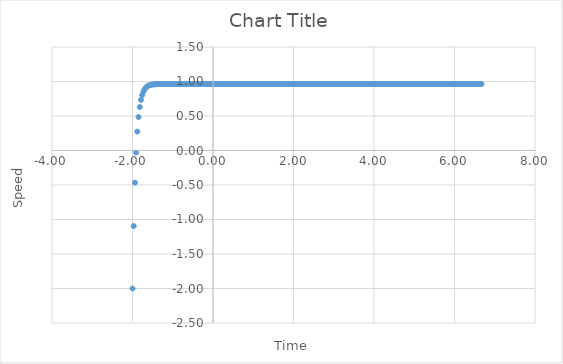
| Category | Series 0 |
|---|---|
| -2.0 | -2 |
| -1.97 | -1.095 |
| -1.94 | -0.466 |
| -1.91 | -0.029 |
| -1.88 | 0.274 |
| -1.8499999999999999 | 0.485 |
| -1.8199999999999998 | 0.631 |
| -1.7899999999999998 | 0.732 |
| -1.7599999999999998 | 0.803 |
| -1.7299999999999998 | 0.852 |
| -1.6999999999999997 | 0.886 |
| -1.6699999999999997 | 0.91 |
| -1.6399999999999997 | 0.926 |
| -1.6099999999999997 | 0.937 |
| -1.5799999999999996 | 0.945 |
| -1.5499999999999996 | 0.951 |
| -1.5199999999999996 | 0.955 |
| -1.4899999999999995 | 0.957 |
| -1.4599999999999995 | 0.959 |
| -1.4299999999999995 | 0.961 |
| -1.3999999999999995 | 0.961 |
| -1.3699999999999994 | 0.962 |
| -1.3399999999999994 | 0.962 |
| -1.3099999999999994 | 0.963 |
| -1.2799999999999994 | 0.963 |
| -1.2499999999999993 | 0.963 |
| -1.2199999999999993 | 0.963 |
| -1.1899999999999993 | 0.963 |
| -1.1599999999999993 | 0.963 |
| -1.1299999999999992 | 0.963 |
| -1.0999999999999992 | 0.963 |
| -1.0699999999999992 | 0.963 |
| -1.0399999999999991 | 0.963 |
| -1.0099999999999991 | 0.963 |
| -0.9799999999999991 | 0.963 |
| -0.9499999999999991 | 0.963 |
| -0.919999999999999 | 0.963 |
| -0.889999999999999 | 0.963 |
| -0.859999999999999 | 0.963 |
| -0.829999999999999 | 0.963 |
| -0.7999999999999989 | 0.963 |
| -0.7699999999999989 | 0.963 |
| -0.7399999999999989 | 0.963 |
| -0.7099999999999989 | 0.963 |
| -0.6799999999999988 | 0.963 |
| -0.6499999999999988 | 0.963 |
| -0.6199999999999988 | 0.963 |
| -0.5899999999999987 | 0.963 |
| -0.5599999999999987 | 0.963 |
| -0.5299999999999987 | 0.963 |
| -0.49999999999999867 | 0.963 |
| -0.46999999999999864 | 0.963 |
| -0.4399999999999986 | 0.963 |
| -0.4099999999999986 | 0.963 |
| -0.37999999999999856 | 0.963 |
| -0.34999999999999853 | 0.963 |
| -0.3199999999999985 | 0.963 |
| -0.2899999999999985 | 0.963 |
| -0.25999999999999845 | 0.963 |
| -0.22999999999999846 | 0.963 |
| -0.19999999999999846 | 0.963 |
| -0.16999999999999846 | 0.963 |
| -0.13999999999999846 | 0.963 |
| -0.10999999999999846 | 0.963 |
| -0.07999999999999846 | 0.963 |
| -0.04999999999999846 | 0.963 |
| -0.019999999999998463 | 0.963 |
| 0.010000000000001535 | 0.963 |
| 0.040000000000001534 | 0.963 |
| 0.07000000000000153 | 0.963 |
| 0.10000000000000153 | 0.963 |
| 0.13000000000000153 | 0.963 |
| 0.16000000000000153 | 0.963 |
| 0.19000000000000153 | 0.963 |
| 0.22000000000000153 | 0.963 |
| 0.25000000000000155 | 0.963 |
| 0.2800000000000016 | 0.963 |
| 0.3100000000000016 | 0.963 |
| 0.34000000000000163 | 0.963 |
| 0.37000000000000166 | 0.963 |
| 0.4000000000000017 | 0.963 |
| 0.4300000000000017 | 0.963 |
| 0.46000000000000174 | 0.963 |
| 0.49000000000000177 | 0.963 |
| 0.5200000000000018 | 0.963 |
| 0.5500000000000018 | 0.963 |
| 0.5800000000000018 | 0.963 |
| 0.6100000000000019 | 0.963 |
| 0.6400000000000019 | 0.963 |
| 0.6700000000000019 | 0.963 |
| 0.700000000000002 | 0.963 |
| 0.730000000000002 | 0.963 |
| 0.760000000000002 | 0.963 |
| 0.790000000000002 | 0.963 |
| 0.8200000000000021 | 0.963 |
| 0.8500000000000021 | 0.963 |
| 0.8800000000000021 | 0.963 |
| 0.9100000000000021 | 0.963 |
| 0.9400000000000022 | 0.963 |
| 0.9700000000000022 | 0.963 |
| 1.0000000000000022 | 0.963 |
| 1.0300000000000022 | 0.963 |
| 1.0600000000000023 | 0.963 |
| 1.0900000000000023 | 0.963 |
| 1.1200000000000023 | 0.963 |
| 1.1500000000000024 | 0.963 |
| 1.1800000000000024 | 0.963 |
| 1.2100000000000024 | 0.963 |
| 1.2400000000000024 | 0.963 |
| 1.2700000000000025 | 0.963 |
| 1.3000000000000025 | 0.963 |
| 1.3300000000000025 | 0.963 |
| 1.3600000000000025 | 0.963 |
| 1.3900000000000026 | 0.963 |
| 1.4200000000000026 | 0.963 |
| 1.4500000000000026 | 0.963 |
| 1.4800000000000026 | 0.963 |
| 1.5100000000000027 | 0.963 |
| 1.5400000000000027 | 0.963 |
| 1.5700000000000027 | 0.963 |
| 1.6000000000000028 | 0.963 |
| 1.6300000000000028 | 0.963 |
| 1.6600000000000028 | 0.963 |
| 1.6900000000000028 | 0.963 |
| 1.7200000000000029 | 0.963 |
| 1.7500000000000029 | 0.963 |
| 1.780000000000003 | 0.963 |
| 1.810000000000003 | 0.963 |
| 1.840000000000003 | 0.963 |
| 1.870000000000003 | 0.963 |
| 1.900000000000003 | 0.963 |
| 1.930000000000003 | 0.963 |
| 1.960000000000003 | 0.963 |
| 1.990000000000003 | 0.963 |
| 2.020000000000003 | 0.963 |
| 2.050000000000003 | 0.963 |
| 2.0800000000000027 | 0.963 |
| 2.1100000000000025 | 0.963 |
| 2.1400000000000023 | 0.963 |
| 2.170000000000002 | 0.963 |
| 2.200000000000002 | 0.963 |
| 2.2300000000000018 | 0.963 |
| 2.2600000000000016 | 0.963 |
| 2.2900000000000014 | 0.963 |
| 2.320000000000001 | 0.963 |
| 2.350000000000001 | 0.963 |
| 2.380000000000001 | 0.963 |
| 2.4100000000000006 | 0.963 |
| 2.4400000000000004 | 0.963 |
| 2.47 | 0.963 |
| 2.5 | 0.963 |
| 2.53 | 0.963 |
| 2.5599999999999996 | 0.963 |
| 2.5899999999999994 | 0.963 |
| 2.619999999999999 | 0.963 |
| 2.649999999999999 | 0.963 |
| 2.679999999999999 | 0.963 |
| 2.7099999999999986 | 0.963 |
| 2.7399999999999984 | 0.963 |
| 2.7699999999999982 | 0.963 |
| 2.799999999999998 | 0.963 |
| 2.829999999999998 | 0.963 |
| 2.8599999999999977 | 0.963 |
| 2.8899999999999975 | 0.963 |
| 2.9199999999999973 | 0.963 |
| 2.949999999999997 | 0.963 |
| 2.979999999999997 | 0.963 |
| 3.0099999999999967 | 0.963 |
| 3.0399999999999965 | 0.963 |
| 3.0699999999999963 | 0.963 |
| 3.099999999999996 | 0.963 |
| 3.129999999999996 | 0.963 |
| 3.1599999999999957 | 0.963 |
| 3.1899999999999955 | 0.963 |
| 3.2199999999999953 | 0.963 |
| 3.249999999999995 | 0.963 |
| 3.279999999999995 | 0.963 |
| 3.3099999999999947 | 0.963 |
| 3.3399999999999945 | 0.963 |
| 3.3699999999999943 | 0.963 |
| 3.399999999999994 | 0.963 |
| 3.429999999999994 | 0.963 |
| 3.4599999999999937 | 0.963 |
| 3.4899999999999936 | 0.963 |
| 3.5199999999999934 | 0.963 |
| 3.549999999999993 | 0.963 |
| 3.579999999999993 | 0.963 |
| 3.6099999999999928 | 0.963 |
| 3.6399999999999926 | 0.963 |
| 3.6699999999999924 | 0.963 |
| 3.699999999999992 | 0.963 |
| 3.729999999999992 | 0.963 |
| 3.759999999999992 | 0.963 |
| 3.7899999999999916 | 0.963 |
| 3.8199999999999914 | 0.963 |
| 3.849999999999991 | 0.963 |
| 3.879999999999991 | 0.963 |
| 3.909999999999991 | 0.963 |
| 3.9399999999999906 | 0.963 |
| 3.9699999999999904 | 0.963 |
| 3.9999999999999902 | 0.963 |
| 4.0299999999999905 | 0.963 |
| 4.059999999999991 | 0.963 |
| 4.089999999999991 | 0.963 |
| 4.119999999999991 | 0.963 |
| 4.1499999999999915 | 0.963 |
| 4.179999999999992 | 0.963 |
| 4.209999999999992 | 0.963 |
| 4.239999999999992 | 0.963 |
| 4.2699999999999925 | 0.963 |
| 4.299999999999993 | 0.963 |
| 4.329999999999993 | 0.963 |
| 4.359999999999993 | 0.963 |
| 4.3899999999999935 | 0.963 |
| 4.419999999999994 | 0.963 |
| 4.449999999999994 | 0.963 |
| 4.479999999999994 | 0.963 |
| 4.5099999999999945 | 0.963 |
| 4.539999999999995 | 0.963 |
| 4.569999999999995 | 0.963 |
| 4.599999999999995 | 0.963 |
| 4.6299999999999955 | 0.963 |
| 4.659999999999996 | 0.963 |
| 4.689999999999996 | 0.963 |
| 4.719999999999996 | 0.963 |
| 4.7499999999999964 | 0.963 |
| 4.779999999999997 | 0.963 |
| 4.809999999999997 | 0.963 |
| 4.839999999999997 | 0.963 |
| 4.869999999999997 | 0.963 |
| 4.899999999999998 | 0.963 |
| 4.929999999999998 | 0.963 |
| 4.959999999999998 | 0.963 |
| 4.989999999999998 | 0.963 |
| 5.019999999999999 | 0.963 |
| 5.049999999999999 | 0.963 |
| 5.079999999999999 | 0.963 |
| 5.109999999999999 | 0.963 |
| 5.14 | 0.963 |
| 5.17 | 0.963 |
| 5.2 | 0.963 |
| 5.23 | 0.963 |
| 5.260000000000001 | 0.963 |
| 5.290000000000001 | 0.963 |
| 5.320000000000001 | 0.963 |
| 5.350000000000001 | 0.963 |
| 5.380000000000002 | 0.963 |
| 5.410000000000002 | 0.963 |
| 5.440000000000002 | 0.963 |
| 5.470000000000002 | 0.963 |
| 5.500000000000003 | 0.963 |
| 5.530000000000003 | 0.963 |
| 5.560000000000003 | 0.963 |
| 5.590000000000003 | 0.963 |
| 5.620000000000004 | 0.963 |
| 5.650000000000004 | 0.963 |
| 5.680000000000004 | 0.963 |
| 5.710000000000004 | 0.963 |
| 5.740000000000005 | 0.963 |
| 5.770000000000005 | 0.963 |
| 5.800000000000005 | 0.963 |
| 5.830000000000005 | 0.963 |
| 5.860000000000006 | 0.963 |
| 5.890000000000006 | 0.963 |
| 5.920000000000006 | 0.963 |
| 5.950000000000006 | 0.963 |
| 5.980000000000007 | 0.963 |
| 6.010000000000007 | 0.963 |
| 6.040000000000007 | 0.963 |
| 6.070000000000007 | 0.963 |
| 6.100000000000008 | 0.963 |
| 6.130000000000008 | 0.963 |
| 6.160000000000008 | 0.963 |
| 6.190000000000008 | 0.963 |
| 6.220000000000009 | 0.963 |
| 6.250000000000009 | 0.963 |
| 6.280000000000009 | 0.963 |
| 6.310000000000009 | 0.963 |
| 6.34000000000001 | 0.963 |
| 6.37000000000001 | 0.963 |
| 6.40000000000001 | 0.963 |
| 6.43000000000001 | 0.963 |
| 6.460000000000011 | 0.963 |
| 6.490000000000011 | 0.963 |
| 6.520000000000011 | 0.963 |
| 6.550000000000011 | 0.963 |
| 6.580000000000012 | 0.963 |
| 6.610000000000012 | 0.963 |
| 6.640000000000012 | 0.963 |
| 6.670000000000012 | 0.963 |